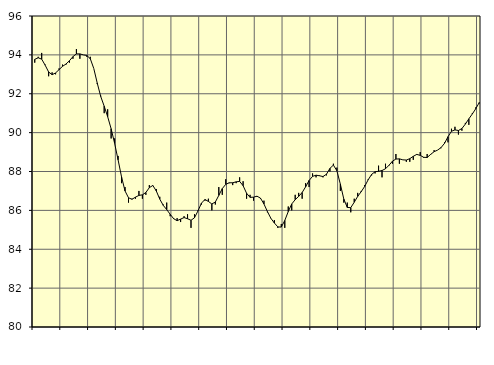
| Category | Piggar | Series 1 |
|---|---|---|
| nan | 93.6 | 93.77 |
| 87.0 | 93.9 | 93.85 |
| 87.0 | 94.1 | 93.78 |
| 87.0 | 93.5 | 93.47 |
| nan | 92.9 | 93.12 |
| 88.0 | 93.1 | 92.98 |
| 88.0 | 93 | 93.07 |
| 88.0 | 93.3 | 93.24 |
| nan | 93.5 | 93.41 |
| 89.0 | 93.5 | 93.53 |
| 89.0 | 93.6 | 93.7 |
| 89.0 | 93.8 | 93.91 |
| nan | 94.3 | 94.05 |
| 90.0 | 93.8 | 94.05 |
| 90.0 | 94 | 94 |
| 90.0 | 93.9 | 93.97 |
| nan | 93.9 | 93.8 |
| 91.0 | 93.3 | 93.3 |
| 91.0 | 92.5 | 92.55 |
| 91.0 | 91.9 | 91.86 |
| nan | 91 | 91.36 |
| 92.0 | 91.2 | 90.82 |
| 92.0 | 89.7 | 90.2 |
| 92.0 | 89.7 | 89.45 |
| nan | 88.8 | 88.6 |
| 93.0 | 87.4 | 87.72 |
| 93.0 | 87.2 | 87 |
| 93.0 | 86.4 | 86.65 |
| nan | 86.6 | 86.57 |
| 94.0 | 86.6 | 86.68 |
| 94.0 | 87 | 86.77 |
| 94.0 | 86.6 | 86.8 |
| nan | 86.8 | 86.92 |
| 95.0 | 87.3 | 87.17 |
| 95.0 | 87.3 | 87.28 |
| 95.0 | 87.1 | 87 |
| nan | 86.7 | 86.58 |
| 96.0 | 86.3 | 86.26 |
| 96.0 | 86.4 | 86.04 |
| 96.0 | 85.7 | 85.8 |
| nan | 85.6 | 85.57 |
| 97.0 | 85.6 | 85.47 |
| 97.0 | 85.4 | 85.55 |
| 97.0 | 85.7 | 85.63 |
| nan | 85.8 | 85.57 |
| 98.0 | 85.1 | 85.49 |
| 98.0 | 85.8 | 85.62 |
| 98.0 | 86 | 85.97 |
| nan | 86.3 | 86.37 |
| 99.0 | 86.5 | 86.56 |
| 99.0 | 86.6 | 86.46 |
| 99.0 | 86 | 86.33 |
| nan | 86.3 | 86.43 |
| 0.0 | 87.2 | 86.77 |
| 0.0 | 86.8 | 87.12 |
| 0.0 | 87.6 | 87.34 |
| nan | 87.4 | 87.42 |
| 1.0 | 87.3 | 87.42 |
| 1.0 | 87.4 | 87.47 |
| 1.0 | 87.7 | 87.49 |
| nan | 87.5 | 87.27 |
| 2.0 | 86.6 | 86.88 |
| 2.0 | 86.8 | 86.67 |
| 2.0 | 86.5 | 86.68 |
| nan | 86.7 | 86.73 |
| 3.0 | 86.6 | 86.63 |
| 3.0 | 86.5 | 86.33 |
| 3.0 | 85.9 | 85.94 |
| nan | 85.6 | 85.59 |
| 4.0 | 85.5 | 85.35 |
| 4.0 | 85.1 | 85.15 |
| 4.0 | 85.3 | 85.14 |
| nan | 85.1 | 85.48 |
| 5.0 | 86.2 | 85.94 |
| 5.0 | 86 | 86.33 |
| 5.0 | 86.8 | 86.55 |
| nan | 86.9 | 86.72 |
| 6.0 | 86.6 | 86.92 |
| 6.0 | 87.4 | 87.21 |
| 6.0 | 87.2 | 87.54 |
| nan | 87.9 | 87.75 |
| 7.0 | 87.7 | 87.81 |
| 7.0 | 87.8 | 87.78 |
| 7.0 | 87.7 | 87.74 |
| nan | 87.8 | 87.86 |
| 8.0 | 88 | 88.16 |
| 8.0 | 88.4 | 88.33 |
| 8.0 | 88.2 | 88.04 |
| nan | 87 | 87.35 |
| 9.0 | 86.4 | 86.58 |
| 9.0 | 86.4 | 86.15 |
| 9.0 | 85.9 | 86.14 |
| nan | 86.6 | 86.42 |
| 10.0 | 86.9 | 86.72 |
| 10.0 | 87 | 86.96 |
| 10.0 | 87.3 | 87.23 |
| nan | 87.6 | 87.57 |
| 11.0 | 87.8 | 87.85 |
| 11.0 | 87.9 | 87.99 |
| 11.0 | 88.3 | 88.01 |
| nan | 87.7 | 88.05 |
| 12.0 | 88.4 | 88.14 |
| 12.0 | 88.3 | 88.32 |
| 12.0 | 88.4 | 88.53 |
| nan | 88.9 | 88.64 |
| 13.0 | 88.4 | 88.65 |
| 13.0 | 88.6 | 88.6 |
| 13.0 | 88.5 | 88.59 |
| nan | 88.5 | 88.66 |
| 14.0 | 88.6 | 88.78 |
| 14.0 | 88.9 | 88.88 |
| 14.0 | 89 | 88.83 |
| nan | 88.7 | 88.73 |
| 15.0 | 88.9 | 88.72 |
| 15.0 | 88.9 | 88.88 |
| 15.0 | 89.1 | 89.02 |
| nan | 89.1 | 89.1 |
| 16.0 | 89.2 | 89.23 |
| 16.0 | 89.5 | 89.45 |
| 16.0 | 89.5 | 89.79 |
| nan | 90.2 | 90.07 |
| 17.0 | 90.3 | 90.14 |
| 17.0 | 89.9 | 90.11 |
| 17.0 | 90.1 | 90.21 |
| nan | 90.5 | 90.44 |
| 18.0 | 90.4 | 90.71 |
| 18.0 | 91 | 90.96 |
| 18.0 | 91.3 | 91.23 |
| nan | 91.5 | 91.55 |